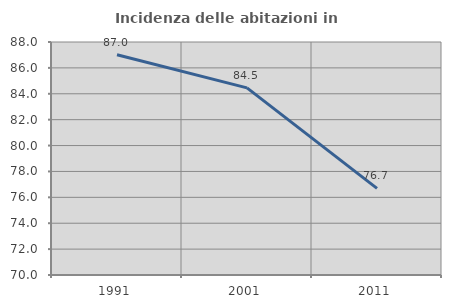
| Category | Incidenza delle abitazioni in proprietà  |
|---|---|
| 1991.0 | 87.018 |
| 2001.0 | 84.459 |
| 2011.0 | 76.689 |